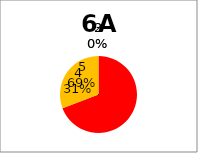
| Category | Series 0 |
|---|---|
| 5.0 | 9 |
| 4.0 | 4 |
| 3.0 | 0 |
| 2.0 | 0 |